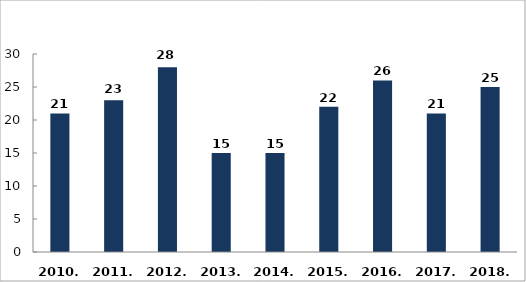
| Category | Meghalt személyek száma (fő) |
|---|---|
| 2010. év | 21 |
| 2011. év | 23 |
| 2012. év | 28 |
| 2013. év | 15 |
| 2014. év | 15 |
| 2015. év | 22 |
| 2016. év | 26 |
| 2017. év | 21 |
| 2018. év | 25 |